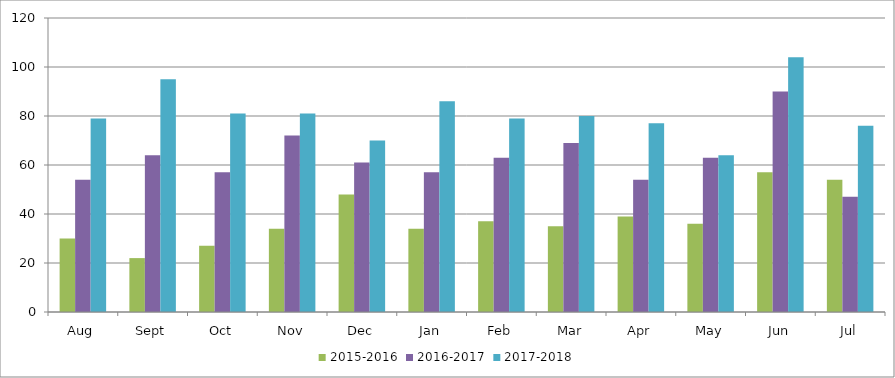
| Category | 2015-2016 | 2016-2017 | 2017-2018 |
|---|---|---|---|
| Aug | 30 | 54 | 79 |
| Sept | 22 | 64 | 95 |
| Oct | 27 | 57 | 81 |
| Nov | 34 | 72 | 81 |
| Dec | 48 | 61 | 70 |
| Jan | 34 | 57 | 86 |
| Feb | 37 | 63 | 79 |
| Mar | 35 | 69 | 80 |
| Apr | 39 | 54 | 77 |
| May | 36 | 63 | 64 |
| Jun | 57 | 90 | 104 |
| Jul | 54 | 47 | 76 |